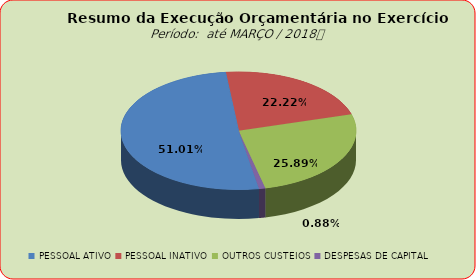
| Category | Series 0 |
|---|---|
| PESSOAL ATIVO | 38298093.21 |
| PESSOAL INATIVO | 16683593.53 |
| OUTROS CUSTEIOS | 19436505.33 |
| DESPESAS DE CAPITAL | 659744.93 |